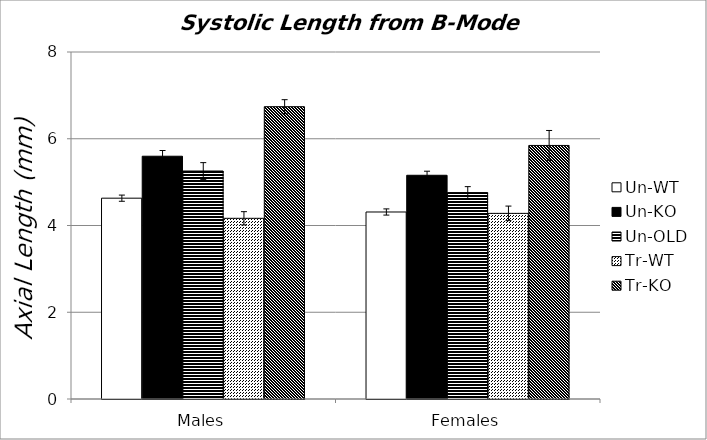
| Category | Un-WT | Un-KO | Un-OLD | Tr-WT | Tr-KO |
|---|---|---|---|---|---|
| 0 | 4.63 | 5.597 | 5.256 | 4.166 | 6.739 |
| 1 | 4.311 | 5.158 | 4.759 | 4.28 | 5.846 |